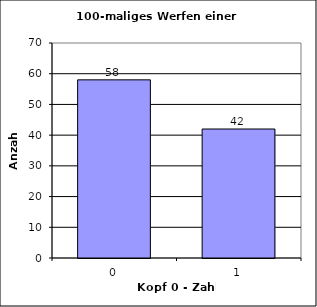
| Category | Series 0 |
|---|---|
| 0.0 | 58 |
| 1.0 | 42 |